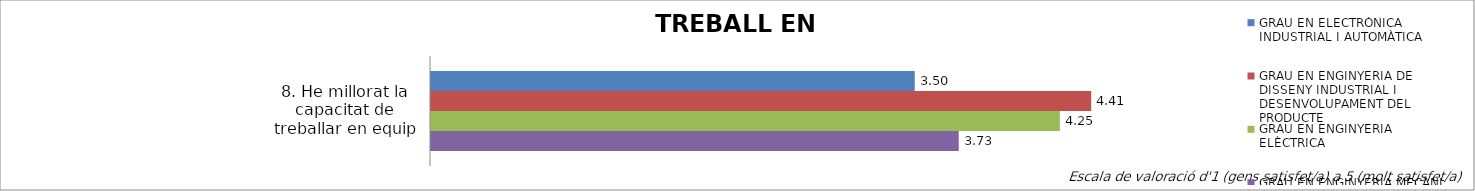
| Category | GRAU EN ELECTRÒNICA INDUSTRIAL I AUTOMÀTICA | GRAU EN ENGINYERIA DE DISSENY INDUSTRIAL I DESENVOLUPAMENT DEL PRODUCTE | GRAU EN ENGINYERIA ELÈCTRICA | GRAU EN ENGINYERIA MECÀNICA |
|---|---|---|---|---|
| 8. He millorat la capacitat de treballar en equip | 3.5 | 4.412 | 4.25 | 3.727 |